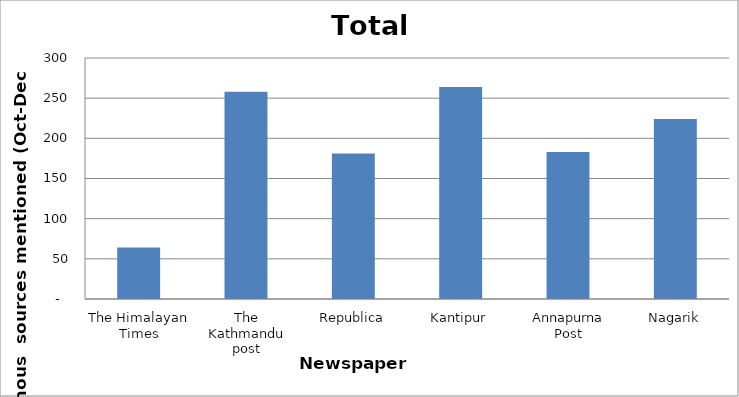
| Category | Total |
|---|---|
| The Himalayan Times | 64 |
| The Kathmandu post | 258 |
| Republica | 181 |
| Kantipur | 264 |
| Annapurna Post | 183 |
| Nagarik | 224 |